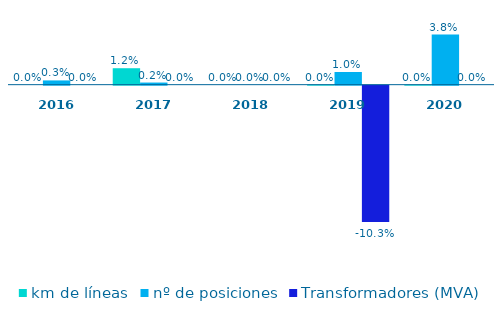
| Category | km de líneas | nº de posiciones | Transformadores (MVA) |
|---|---|---|---|
| 2016.0 | 0 | 0.003 | 0 |
| 2017.0 | 0.012 | 0.002 | 0 |
| 2018.0 | 0 | 0 | 0 |
| 2019.0 | 0 | 0.01 | -0.103 |
| 2020.0 | 0 | 0.038 | 0 |